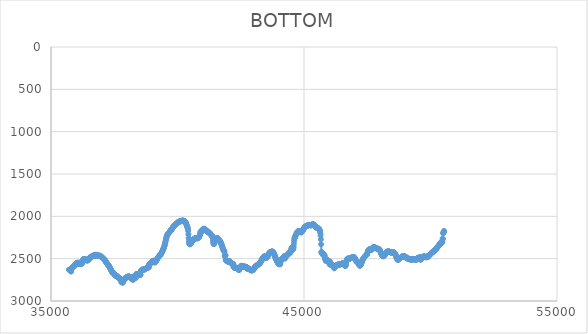
| Category | BOTTOM |
|---|---|
| 35711.8231 | 2631.15 |
| 35722.0632 | 2631.15 |
| 35732.3032 | 2631.15 |
| 35742.5432 | 2631.15 |
| 35752.7832 | 2631.15 |
| 35763.0233 | 2635.37 |
| 35773.2633 | 2641 |
| 35783.5033 | 2646.63 |
| 35793.7433 | 2652.27 |
| 35803.9833 | 2618.48 |
| 35814.2234 | 2612.85 |
| 35824.4634 | 2612.85 |
| 35834.7034 | 2607.22 |
| 35844.9434 | 2608.63 |
| 35855.1834 | 2605.81 |
| 35865.4235 | 2603 |
| 35875.6635 | 2597.37 |
| 35885.9035 | 2591.74 |
| 35896.1435 | 2590.33 |
| 35906.3836 | 2590.33 |
| 35916.6236 | 2590.33 |
| 35926.8636 | 2588.92 |
| 35937.1036 | 2584.7 |
| 35947.3436 | 2579.07 |
| 35957.5837 | 2569.22 |
| 35967.8237 | 2566.4 |
| 35978.0637 | 2560.77 |
| 35988.3037 | 2560.77 |
| 35998.5437 | 2556.55 |
| 36008.7838 | 2550.92 |
| 36019.0238 | 2553.73 |
| 36029.2638 | 2553.73 |
| 36039.5038 | 2549.51 |
| 36049.7439 | 2552.32 |
| 36059.9839 | 2553.73 |
| 36070.2239 | 2549.51 |
| 36080.4639 | 2548.1 |
| 36090.7039 | 2548.1 |
| 36100.944 | 2564.99 |
| 36111.184 | 2562.18 |
| 36121.424 | 2559.36 |
| 36131.664 | 2555.14 |
| 36141.904 | 2549.51 |
| 36152.1441 | 2555.14 |
| 36162.3841 | 2560.77 |
| 36172.6241 | 2556.55 |
| 36182.8641 | 2556.55 |
| 36193.1042 | 2559.36 |
| 36203.3442 | 2556.55 |
| 36213.5842 | 2556.55 |
| 36223.8242 | 2556.55 |
| 36234.0642 | 2553.73 |
| 36244.3043 | 2548.1 |
| 36254.5443 | 2512.91 |
| 36264.7843 | 2512.91 |
| 36275.0243 | 2510.1 |
| 36285.2643 | 2504.47 |
| 36295.5044 | 2508.69 |
| 36305.7444 | 2512.91 |
| 36315.9844 | 2510.1 |
| 36326.2244 | 2508.69 |
| 36336.4645 | 2511.5 |
| 36346.7045 | 2508.69 |
| 36356.9445 | 2508.69 |
| 36367.1845 | 2508.69 |
| 36377.4245 | 2508.69 |
| 36387.6646 | 2515.73 |
| 36397.9046 | 2515.73 |
| 36408.1446 | 2517.13 |
| 36418.3846 | 2519.95 |
| 36428.6247 | 2519.95 |
| 36438.8647 | 2521.36 |
| 36449.1047 | 2519.95 |
| 36459.3447 | 2517.13 |
| 36469.5847 | 2512.91 |
| 36479.8248 | 2514.32 |
| 36490.0648 | 2508.69 |
| 36500.3048 | 2504.47 |
| 36510.5448 | 2501.65 |
| 36520.7848 | 2501.65 |
| 36531.0249 | 2487.57 |
| 36541.2649 | 2483.35 |
| 36551.5049 | 2483.35 |
| 36561.7449 | 2487.57 |
| 36571.985 | 2488.98 |
| 36582.225 | 2479.13 |
| 36592.465 | 2477.72 |
| 36602.705 | 2479.13 |
| 36612.945 | 2474.91 |
| 36623.1851 | 2470.68 |
| 36633.4251 | 2470.68 |
| 36643.6651 | 2467.87 |
| 36653.9051 | 2465.05 |
| 36664.1451 | 2466.46 |
| 36674.3852 | 2467.87 |
| 36684.6252 | 2465.05 |
| 36694.8652 | 2460.83 |
| 36705.1052 | 2460.83 |
| 36715.3453 | 2460.83 |
| 36725.5853 | 2467.87 |
| 36735.8253 | 2465.05 |
| 36746.0653 | 2458.01 |
| 36756.3053 | 2462.24 |
| 36766.5454 | 2453.79 |
| 36776.7854 | 2455.2 |
| 36787.0254 | 2455.2 |
| 36797.2654 | 2462.24 |
| 36807.5054 | 2460.83 |
| 36817.7455 | 2463.64 |
| 36827.9855 | 2456.61 |
| 36838.2255 | 2462.24 |
| 36848.4655 | 2460.83 |
| 36858.7056 | 2462.24 |
| 36868.9456 | 2462.24 |
| 36879.1856 | 2462.24 |
| 36889.4256 | 2466.46 |
| 36899.6656 | 2466.46 |
| 36909.9057 | 2466.46 |
| 36920.1457 | 2466.46 |
| 36930.3857 | 2470.68 |
| 36940.6257 | 2465.05 |
| 36950.8657 | 2467.87 |
| 36961.1058 | 2469.28 |
| 36971.3458 | 2472.09 |
| 36981.5858 | 2476.31 |
| 36991.8258 | 2476.31 |
| 37002.0659 | 2479.13 |
| 37012.3059 | 2480.54 |
| 37022.5459 | 2486.17 |
| 37032.7859 | 2488.98 |
| 37043.0259 | 2494.61 |
| 37053.266 | 2493.2 |
| 37063.506 | 2497.43 |
| 37073.746 | 2503.06 |
| 37083.986 | 2503.06 |
| 37094.2261 | 2507.28 |
| 37104.4661 | 2510.1 |
| 37114.7061 | 2512.91 |
| 37124.9461 | 2517.13 |
| 37135.1861 | 2515.73 |
| 37145.4262 | 2526.99 |
| 37155.6662 | 2526.99 |
| 37165.9062 | 2536.84 |
| 37176.1462 | 2540.96 |
| 37186.3862 | 2545.07 |
| 37196.6263 | 2549.18 |
| 37206.8663 | 2553.3 |
| 37217.1063 | 2557.41 |
| 37227.3463 | 2561.53 |
| 37237.5864 | 2565.64 |
| 37247.8264 | 2569.76 |
| 37258.0664 | 2573.87 |
| 37268.3064 | 2577.99 |
| 37278.5464 | 2582.1 |
| 37288.7865 | 2586.22 |
| 37299.0265 | 2590.33 |
| 37309.2665 | 2596.29 |
| 37319.5065 | 2602.24 |
| 37329.7465 | 2608.2 |
| 37339.9866 | 2614.15 |
| 37350.2266 | 2620.11 |
| 37360.4666 | 2626.06 |
| 37370.7066 | 2632.02 |
| 37380.9467 | 2637.97 |
| 37391.1867 | 2643.93 |
| 37401.4267 | 2649.88 |
| 37411.6667 | 2655.84 |
| 37421.9067 | 2661.79 |
| 37432.1468 | 2667.75 |
| 37442.3868 | 2662.12 |
| 37452.6268 | 2662.12 |
| 37462.8668 | 2666.34 |
| 37473.1069 | 2671.97 |
| 37483.3469 | 2673.38 |
| 37493.5869 | 2679.01 |
| 37503.8269 | 2683.23 |
| 37514.0669 | 2680.42 |
| 37524.307 | 2694.49 |
| 37534.547 | 2698.72 |
| 37544.787 | 2697.31 |
| 37555.027 | 2700.12 |
| 37565.267 | 2701.53 |
| 37575.5071 | 2701.53 |
| 37585.7471 | 2702.94 |
| 37595.9871 | 2707.16 |
| 37606.2271 | 2705.75 |
| 37616.4672 | 2707.16 |
| 37626.7072 | 2709.98 |
| 37636.9472 | 2719.83 |
| 37647.1872 | 2719.83 |
| 37657.4272 | 2721.24 |
| 37667.6673 | 2722.65 |
| 37677.9073 | 2725.46 |
| 37688.1473 | 2729.68 |
| 37698.3873 | 2732.5 |
| 37708.6273 | 2733.91 |
| 37718.8674 | 2735.31 |
| 37729.1074 | 2738.13 |
| 37739.3474 | 2742.35 |
| 37749.5874 | 2743.76 |
| 37759.8275 | 2747.98 |
| 37770.0675 | 2747.98 |
| 37780.3075 | 2778.95 |
| 37790.5475 | 2773.32 |
| 37800.7875 | 2767.69 |
| 37811.0276 | 2767.69 |
| 37821.2676 | 2773.32 |
| 37831.5076 | 2778.95 |
| 37841.7476 | 2784.58 |
| 37851.9877 | 2747.98 |
| 37862.2277 | 2750.8 |
| 37872.4677 | 2755.02 |
| 37882.7077 | 2750.8 |
| 37892.9477 | 2749.39 |
| 37903.1878 | 2743.76 |
| 37913.4278 | 2738.13 |
| 37923.6678 | 2732.5 |
| 37933.9078 | 2732.5 |
| 37944.1478 | 2726.87 |
| 37954.3879 | 2725.46 |
| 37964.6279 | 2719.83 |
| 37974.8679 | 2719.83 |
| 37985.1079 | 2721.24 |
| 37995.348 | 2721.24 |
| 38005.588 | 2719.83 |
| 38015.828 | 2717.02 |
| 38026.068 | 2715.61 |
| 38036.308 | 2714.2 |
| 38046.5481 | 2714.2 |
| 38056.7881 | 2711.39 |
| 38067.0281 | 2711.39 |
| 38077.2681 | 2712.79 |
| 38087.5081 | 2712.79 |
| 38097.7482 | 2714.2 |
| 38107.9882 | 2714.2 |
| 38118.2282 | 2715.61 |
| 38128.4682 | 2717.02 |
| 38138.7083 | 2721.24 |
| 38148.9483 | 2721.24 |
| 38159.1883 | 2725.46 |
| 38169.4283 | 2728.28 |
| 38179.6683 | 2733.91 |
| 38189.9084 | 2735.31 |
| 38200.1484 | 2739.54 |
| 38210.3884 | 2738.13 |
| 38220.6284 | 2742.35 |
| 38230.8685 | 2745.17 |
| 38241.1085 | 2750.8 |
| 38251.3485 | 2715.61 |
| 38261.5885 | 2712.79 |
| 38271.8285 | 2709.98 |
| 38282.0686 | 2709.98 |
| 38292.3086 | 2715.61 |
| 38302.5486 | 2718.42 |
| 38312.7886 | 2718.42 |
| 38323.0286 | 2721.24 |
| 38333.2687 | 2718.42 |
| 38343.5087 | 2724.05 |
| 38353.7487 | 2726.87 |
| 38363.9887 | 2684.64 |
| 38374.2288 | 2686.05 |
| 38384.4688 | 2681.83 |
| 38394.7088 | 2681.83 |
| 38404.9488 | 2681.83 |
| 38415.1888 | 2683.23 |
| 38425.4289 | 2683.23 |
| 38435.6689 | 2688.86 |
| 38445.9089 | 2694.49 |
| 38456.1489 | 2694.49 |
| 38466.3889 | 2691.68 |
| 38476.629 | 2686.05 |
| 38486.869 | 2691.68 |
| 38497.109 | 2693.09 |
| 38507.349 | 2691.68 |
| 38517.5891 | 2690.27 |
| 38527.8291 | 2690.27 |
| 38538.0691 | 2688.86 |
| 38548.3091 | 2643.82 |
| 38558.5491 | 2649.45 |
| 38568.7892 | 2643.82 |
| 38579.0292 | 2642.41 |
| 38589.2692 | 2636.78 |
| 38599.5092 | 2631.15 |
| 38609.7493 | 2629.74 |
| 38619.9893 | 2633.97 |
| 38630.2293 | 2628.34 |
| 38640.4693 | 2626.93 |
| 38650.7093 | 2632.56 |
| 38660.9494 | 2631.15 |
| 38671.1894 | 2629.74 |
| 38681.4294 | 2628.34 |
| 38691.6694 | 2626.93 |
| 38701.9094 | 2625.52 |
| 38712.1495 | 2623.57 |
| 38722.3895 | 2621.62 |
| 38732.6295 | 2619.67 |
| 38742.8695 | 2617.72 |
| 38753.1096 | 2615.78 |
| 38763.3496 | 2613.83 |
| 38773.5896 | 2611.88 |
| 38783.8296 | 2609.93 |
| 38794.0696 | 2607.98 |
| 38804.3097 | 2606.03 |
| 38814.5497 | 2604.08 |
| 38824.7897 | 2602.13 |
| 38835.0297 | 2600.18 |
| 38845.2698 | 2600.18 |
| 38855.5098 | 2604.41 |
| 38865.7498 | 2601.59 |
| 38875.9898 | 2570.62 |
| 38886.2298 | 2564.99 |
| 38896.4699 | 2559.36 |
| 38906.7099 | 2559.36 |
| 38916.9499 | 2559.36 |
| 38927.1899 | 2559.36 |
| 38937.4299 | 2553.73 |
| 38947.67 | 2549.51 |
| 38957.91 | 2545.29 |
| 38968.15 | 2545.29 |
| 38978.39 | 2543.88 |
| 38988.6301 | 2534.03 |
| 38998.8701 | 2534.03 |
| 39009.1101 | 2529.8 |
| 39019.3501 | 2528.4 |
| 39029.5901 | 2524.17 |
| 39039.8302 | 2526.99 |
| 39050.0702 | 2525.58 |
| 39060.3102 | 2532.61 |
| 39070.5502 | 2537.72 |
| 39080.7903 | 2541.06 |
| 39091.0303 | 2542.79 |
| 39101.2703 | 2543.06 |
| 39111.5103 | 2542.02 |
| 39121.7503 | 2539.84 |
| 39131.9904 | 2536.67 |
| 39142.2304 | 2532.65 |
| 39152.4704 | 2527.96 |
| 39162.7104 | 2522.73 |
| 39172.9504 | 2517.13 |
| 39183.1905 | 2511.32 |
| 39193.4305 | 2505.44 |
| 39203.6705 | 2499.66 |
| 39213.9105 | 2494.12 |
| 39224.1506 | 2488.98 |
| 39234.3906 | 2484.36 |
| 39244.6306 | 2480.21 |
| 39254.8706 | 2476.43 |
| 39265.1106 | 2472.93 |
| 39275.3507 | 2469.61 |
| 39285.5907 | 2466.4 |
| 39295.8307 | 2463.18 |
| 39306.0707 | 2459.88 |
| 39316.3108 | 2456.4 |
| 39326.5508 | 2452.64 |
| 39336.7908 | 2448.52 |
| 39347.0308 | 2443.94 |
| 39357.2708 | 2438.83 |
| 39367.5109 | 2433.25 |
| 39377.7509 | 2427.24 |
| 39387.9909 | 2420.89 |
| 39398.2309 | 2414.25 |
| 39408.4709 | 2407.4 |
| 39418.711 | 2400.4 |
| 39428.951 | 2393.32 |
| 39439.191 | 2386.23 |
| 39449.431 | 2379.1 |
| 39459.6711 | 2371.61 |
| 39469.9111 | 2363.34 |
| 39480.1511 | 2353.85 |
| 39490.3911 | 2342.86 |
| 39500.6311 | 2330.61 |
| 39510.8712 | 2317.44 |
| 39521.1112 | 2303.72 |
| 39531.3512 | 2289.81 |
| 39541.5912 | 2276.07 |
| 39551.8313 | 2262.86 |
| 39562.0713 | 2250.53 |
| 39572.3113 | 2239.45 |
| 39582.5513 | 2229.98 |
| 39592.7913 | 2222.35 |
| 39603.0314 | 2216.31 |
| 39613.2714 | 2211.48 |
| 39623.5114 | 2207.47 |
| 39633.7514 | 2203.91 |
| 39643.9914 | 2200.42 |
| 39654.2315 | 2196.7 |
| 39664.4715 | 2192.75 |
| 39674.7115 | 2188.67 |
| 39684.9515 | 2184.54 |
| 39695.1916 | 2180.45 |
| 39705.4316 | 2176.49 |
| 39715.6716 | 2172.72 |
| 39725.9116 | 2169.07 |
| 39736.1516 | 2165.47 |
| 39746.3917 | 2161.82 |
| 39756.6317 | 2158.04 |
| 39766.8717 | 2154.05 |
| 39777.1117 | 2149.75 |
| 39787.3518 | 2145.1 |
| 39797.5918 | 2140.22 |
| 39807.8318 | 2135.27 |
| 39818.0718 | 2130.41 |
| 39828.3118 | 2125.79 |
| 39838.5519 | 2121.59 |
| 39848.7919 | 2117.92 |
| 39859.0319 | 2114.71 |
| 39869.2719 | 2111.85 |
| 39879.5119 | 2109.23 |
| 39889.752 | 2106.76 |
| 39899.992 | 2104.31 |
| 39910.232 | 2101.79 |
| 39920.472 | 2099.07 |
| 39930.7121 | 2096.09 |
| 39940.9521 | 2092.9 |
| 39951.1921 | 2089.57 |
| 39961.4321 | 2086.19 |
| 39971.6721 | 2082.84 |
| 39981.9122 | 2079.59 |
| 39992.1522 | 2076.53 |
| 40002.3922 | 2073.74 |
| 40012.6322 | 2071.27 |
| 40022.8723 | 2069.13 |
| 40033.1123 | 2067.26 |
| 40043.3523 | 2065.65 |
| 40053.5923 | 2064.25 |
| 40063.8323 | 2063.04 |
| 40074.0724 | 2061.97 |
| 40084.3124 | 2061.02 |
| 40094.5524 | 2060.15 |
| 40104.7924 | 2059.33 |
| 40115.0325 | 2058.53 |
| 40125.2725 | 2057.71 |
| 40135.5125 | 2056.84 |
| 40145.7525 | 2055.91 |
| 40155.9925 | 2054.94 |
| 40166.2326 | 2054 |
| 40176.4726 | 2053.14 |
| 40186.7126 | 2052.41 |
| 40196.9526 | 2051.88 |
| 40207.1926 | 2051.59 |
| 40217.4327 | 2051.61 |
| 40227.6727 | 2051.98 |
| 40237.9127 | 2052.75 |
| 40248.1527 | 2054 |
| 40258.3928 | 2055.76 |
| 40268.6328 | 2058.1 |
| 40278.8728 | 2061.07 |
| 40289.1128 | 2059.33 |
| 40299.3528 | 2060.54 |
| 40309.5929 | 2064.25 |
| 40319.8329 | 2070 |
| 40330.0729 | 2077.32 |
| 40340.3129 | 2085.75 |
| 40350.553 | 2094.85 |
| 40360.793 | 2104.14 |
| 40371.033 | 2113.18 |
| 40381.273 | 2121.49 |
| 40391.513 | 2128.63 |
| 40401.7531 | 2135.39 |
| 40411.9931 | 2147.58 |
| 40422.2331 | 2172.27 |
| 40432.4731 | 2212.87 |
| 40442.7131 | 2258.13 |
| 40452.9532 | 2294.73 |
| 40463.1932 | 2317.2 |
| 40473.4332 | 2327.8 |
| 40483.6732 | 2330.31 |
| 40493.9133 | 2328.51 |
| 40504.1533 | 2325.58 |
| 40514.3933 | 2322.19 |
| 40524.6333 | 2318.43 |
| 40534.8733 | 2314.36 |
| 40545.1134 | 2310.06 |
| 40555.3534 | 2305.6 |
| 40565.5934 | 2301.06 |
| 40575.8334 | 2296.5 |
| 40586.0735 | 2292 |
| 40596.3135 | 2287.63 |
| 40606.5535 | 2283.47 |
| 40616.7935 | 2279.57 |
| 40627.0335 | 2275.96 |
| 40637.2736 | 2272.65 |
| 40647.5136 | 2269.64 |
| 40657.7536 | 2266.96 |
| 40667.9936 | 2264.6 |
| 40678.2337 | 2262.58 |
| 40688.4737 | 2260.92 |
| 40698.7137 | 2259.61 |
| 40708.9537 | 2258.68 |
| 40719.1937 | 2258.13 |
| 40729.4338 | 2257.96 |
| 40739.6738 | 2258.05 |
| 40749.9138 | 2258.3 |
| 40760.1538 | 2258.58 |
| 40770.3938 | 2258.77 |
| 40780.6339 | 2258.76 |
| 40790.8739 | 2258.41 |
| 40801.1139 | 2257.61 |
| 40811.3539 | 2256.24 |
| 40821.594 | 2254.18 |
| 40831.834 | 2251.31 |
| 40842.074 | 2247.51 |
| 40852.314 | 2242.65 |
| 40862.554 | 2236.62 |
| 40872.7941 | 2229.29 |
| 40883.0341 | 2220.55 |
| 40893.2741 | 2210.27 |
| 40903.5141 | 2189.16 |
| 40913.7542 | 2190.57 |
| 40923.9942 | 2179.31 |
| 40934.2342 | 2177.9 |
| 40944.4742 | 2169.45 |
| 40954.7142 | 2169.45 |
| 40964.9543 | 2168.05 |
| 40975.1943 | 2177.9 |
| 40985.4343 | 2177.9 |
| 40995.6743 | 2156.78 |
| 41005.9143 | 2152.56 |
| 41016.1544 | 2151.15 |
| 41026.3944 | 2149.75 |
| 41036.6344 | 2148.34 |
| 41046.8744 | 2148.34 |
| 41057.1145 | 2148.34 |
| 41067.3545 | 2148.34 |
| 41077.5945 | 2149.75 |
| 41087.8345 | 2161.01 |
| 41098.0745 | 2163.82 |
| 41108.3146 | 2158.19 |
| 41118.5546 | 2163.82 |
| 41128.7946 | 2169.45 |
| 41139.0346 | 2168.05 |
| 41149.2747 | 2172.27 |
| 41159.5147 | 2175.08 |
| 41169.7547 | 2177.9 |
| 41179.9947 | 2180.71 |
| 41190.2347 | 2180.71 |
| 41200.4748 | 2186.34 |
| 41210.7148 | 2183.53 |
| 41220.9548 | 2184.94 |
| 41231.1948 | 2191.97 |
| 41241.4349 | 2194.79 |
| 41251.6749 | 2193.38 |
| 41261.9149 | 2194.79 |
| 41272.1549 | 2197.61 |
| 41282.3949 | 2197.61 |
| 41292.635 | 2207.46 |
| 41302.875 | 2208.87 |
| 41313.115 | 2208.87 |
| 41323.355 | 2218.72 |
| 41333.5951 | 2220.13 |
| 41343.8351 | 2222.94 |
| 41354.0751 | 2225.76 |
| 41364.3151 | 2227.17 |
| 41374.5551 | 2238.43 |
| 41384.7952 | 2238.43 |
| 41395.0352 | 2255.32 |
| 41405.2752 | 2288.41 |
| 41415.5152 | 2310.39 |
| 41425.7552 | 2322.88 |
| 41435.9953 | 2327.5 |
| 41446.2353 | 2325.87 |
| 41456.4753 | 2319.59 |
| 41466.7153 | 2310.29 |
| 41476.9554 | 2299.59 |
| 41487.1954 | 2289.1 |
| 41497.4354 | 2280.15 |
| 41507.6754 | 2272.9 |
| 41517.9154 | 2267.25 |
| 41528.1555 | 2263.06 |
| 41538.3955 | 2260.21 |
| 41548.6355 | 2258.6 |
| 41558.8755 | 2258.08 |
| 41569.1156 | 2258.55 |
| 41579.3556 | 2259.88 |
| 41589.5956 | 2261.96 |
| 41599.8356 | 2264.66 |
| 41610.0756 | 2267.85 |
| 41620.3157 | 2271.43 |
| 41630.5557 | 2275.27 |
| 41640.7957 | 2279.25 |
| 41651.0357 | 2283.28 |
| 41661.2758 | 2287.41 |
| 41671.5158 | 2291.72 |
| 41681.7558 | 2296.31 |
| 41691.9958 | 2301.25 |
| 41702.2358 | 2306.62 |
| 41712.4759 | 2312.51 |
| 41722.7159 | 2319.01 |
| 41732.9559 | 2326.19 |
| 41743.1959 | 2334.14 |
| 41753.4359 | 2342.89 |
| 41763.676 | 2352.19 |
| 41773.916 | 2361.75 |
| 41784.156 | 2371.27 |
| 41794.396 | 2380.47 |
| 41804.6361 | 2389.04 |
| 41814.8761 | 2396.69 |
| 41825.1161 | 2403.12 |
| 41835.3561 | 2405.93 |
| 41845.5961 | 2411.56 |
| 41855.8362 | 2415.79 |
| 41866.0762 | 2470.68 |
| 41876.3162 | 2465.05 |
| 41886.5562 | 2459.42 |
| 41896.7963 | 2460.83 |
| 41907.0363 | 2517.13 |
| 41917.2763 | 2522.76 |
| 41927.5163 | 2517.13 |
| 41937.7563 | 2524.17 |
| 41947.9964 | 2524.17 |
| 41958.2364 | 2526.99 |
| 41968.4764 | 2525.58 |
| 41978.7164 | 2525.58 |
| 41988.9565 | 2526.99 |
| 41999.1965 | 2538.25 |
| 42009.4365 | 2534.03 |
| 42019.6765 | 2535.43 |
| 42029.9165 | 2532.62 |
| 42040.1566 | 2535.43 |
| 42050.3966 | 2534.03 |
| 42060.6366 | 2528.4 |
| 42070.8766 | 2531.21 |
| 42081.1167 | 2542.47 |
| 42091.3567 | 2543.88 |
| 42101.5967 | 2545.29 |
| 42111.8367 | 2545.29 |
| 42122.0767 | 2550.92 |
| 42132.3168 | 2550.92 |
| 42142.5568 | 2550.92 |
| 42152.7968 | 2556.55 |
| 42163.0368 | 2560.77 |
| 42173.2768 | 2560.77 |
| 42183.5169 | 2560.77 |
| 42193.7569 | 2564.99 |
| 42203.9969 | 2562.18 |
| 42214.2369 | 2593.15 |
| 42224.477 | 2597.37 |
| 42234.717 | 2603 |
| 42244.957 | 2608.63 |
| 42255.197 | 2608.63 |
| 42265.437 | 2607.22 |
| 42275.6771 | 2607.22 |
| 42285.9171 | 2607.22 |
| 42296.1571 | 2605.81 |
| 42306.3971 | 2605.81 |
| 42316.6372 | 2610.04 |
| 42326.8772 | 2608.63 |
| 42337.1172 | 2610.04 |
| 42347.3572 | 2610.04 |
| 42357.5972 | 2612.85 |
| 42367.8373 | 2612.85 |
| 42378.0773 | 2614.26 |
| 42388.3173 | 2618.48 |
| 42398.5573 | 2621.3 |
| 42408.7974 | 2622.71 |
| 42419.0374 | 2633.97 |
| 42429.2774 | 2635.37 |
| 42439.5174 | 2629.74 |
| 42449.7574 | 2624.11 |
| 42459.9975 | 2619.89 |
| 42470.2375 | 2614.26 |
| 42480.4775 | 2608.63 |
| 42490.7175 | 2604.41 |
| 42500.9576 | 2604.41 |
| 42511.1976 | 2586.11 |
| 42521.4376 | 2583.29 |
| 42531.6776 | 2586.11 |
| 42541.9176 | 2591.74 |
| 42552.1577 | 2593.15 |
| 42562.3977 | 2591.74 |
| 42572.6377 | 2591.74 |
| 42582.8777 | 2593.15 |
| 42593.1177 | 2590.33 |
| 42603.3578 | 2594.55 |
| 42613.5978 | 2597.37 |
| 42623.8378 | 2598.78 |
| 42634.0778 | 2593.15 |
| 42644.3179 | 2594.55 |
| 42654.5579 | 2594.55 |
| 42664.7979 | 2594.55 |
| 42675.0379 | 2595.96 |
| 42685.2779 | 2597.37 |
| 42695.518 | 2597.37 |
| 42705.758 | 2598.78 |
| 42715.998 | 2598.78 |
| 42726.238 | 2600.18 |
| 42736.4781 | 2605.81 |
| 42746.7181 | 2604.41 |
| 42756.9581 | 2605.81 |
| 42767.1981 | 2622.71 |
| 42777.4381 | 2617.08 |
| 42787.6782 | 2617.08 |
| 42797.9182 | 2617.08 |
| 42808.1582 | 2618.48 |
| 42818.3982 | 2618.48 |
| 42828.6383 | 2618.48 |
| 42838.8783 | 2621.3 |
| 42849.1183 | 2625.52 |
| 42859.3583 | 2628.34 |
| 42869.5983 | 2629.74 |
| 42879.8384 | 2635.37 |
| 42890.0784 | 2633.97 |
| 42900.3184 | 2635.37 |
| 42910.5584 | 2638.19 |
| 42920.7985 | 2639.6 |
| 42931.0385 | 2633.97 |
| 42941.2785 | 2632.56 |
| 42951.5185 | 2638.19 |
| 42961.7585 | 2635.37 |
| 42971.9986 | 2628.34 |
| 42982.2386 | 2633.97 |
| 42992.4786 | 2633.97 |
| 43002.7186 | 2628.34 |
| 43012.9587 | 2622.23 |
| 43023.1987 | 2616.63 |
| 43033.4387 | 2611.49 |
| 43043.6787 | 2606.8 |
| 43053.9187 | 2602.52 |
| 43064.1588 | 2598.62 |
| 43074.3988 | 2595.07 |
| 43084.6388 | 2591.85 |
| 43094.8788 | 2588.92 |
| 43105.1188 | 2586.26 |
| 43115.3589 | 2583.83 |
| 43125.5989 | 2581.61 |
| 43135.8389 | 2579.56 |
| 43146.0789 | 2577.66 |
| 43156.319 | 2575.87 |
| 43166.559 | 2574.15 |
| 43176.799 | 2572.43 |
| 43187.039 | 2570.67 |
| 43197.279 | 2568.8 |
| 43207.5191 | 2566.77 |
| 43217.7591 | 2564.53 |
| 43227.9991 | 2562.02 |
| 43238.2391 | 2559.18 |
| 43248.4792 | 2555.97 |
| 43258.7192 | 2552.32 |
| 43268.9592 | 2548.21 |
| 43279.1992 | 2543.64 |
| 43289.4392 | 2538.68 |
| 43299.6793 | 2533.36 |
| 43309.9193 | 2527.73 |
| 43320.1593 | 2521.84 |
| 43330.3993 | 2515.73 |
| 43340.6394 | 2509.47 |
| 43350.8794 | 2503.25 |
| 43361.1194 | 2497.29 |
| 43371.3594 | 2491.8 |
| 43381.5994 | 2486.97 |
| 43391.8395 | 2482.86 |
| 43402.0795 | 2479.49 |
| 43412.3195 | 2476.88 |
| 43422.5595 | 2475.08 |
| 43432.7996 | 2474.09 |
| 43443.0396 | 2473.95 |
| 43453.2796 | 2474.68 |
| 43463.5196 | 2476.31 |
| 43473.7596 | 2478.79 |
| 43483.9997 | 2481.73 |
| 43494.2397 | 2484.69 |
| 43504.4797 | 2487.21 |
| 43514.7197 | 2488.83 |
| 43524.9598 | 2489.11 |
| 43535.1998 | 2487.57 |
| 43545.4398 | 2483.94 |
| 43555.6798 | 2478.54 |
| 43565.9198 | 2471.88 |
| 43576.1599 | 2464.45 |
| 43586.3999 | 2456.75 |
| 43596.6399 | 2449.28 |
| 43606.8799 | 2442.53 |
| 43617.12 | 2436.9 |
| 43627.36 | 2432.36 |
| 43637.6 | 2428.76 |
| 43647.84 | 2425.98 |
| 43658.08 | 2423.86 |
| 43668.3201 | 2422.29 |
| 43678.5601 | 2421.11 |
| 43688.8001 | 2420.2 |
| 43699.0401 | 2419.41 |
| 43709.2801 | 2418.6 |
| 43719.5202 | 2417.71 |
| 43729.7602 | 2416.93 |
| 43740.0002 | 2416.51 |
| 43750.2402 | 2416.71 |
| 43760.4803 | 2417.79 |
| 43770.7203 | 2420.01 |
| 43780.9603 | 2423.55 |
| 43791.2003 | 2428.3 |
| 43801.4403 | 2434.11 |
| 43811.6804 | 2440.78 |
| 43821.9204 | 2448.16 |
| 43832.1604 | 2456.06 |
| 43842.4004 | 2464.29 |
| 43852.6405 | 2472.65 |
| 43862.8805 | 2480.95 |
| 43873.1205 | 2488.98 |
| 43883.3605 | 2496.6 |
| 43893.6005 | 2503.82 |
| 43903.8406 | 2510.69 |
| 43914.0806 | 2517.27 |
| 43924.3206 | 2523.62 |
| 43934.5606 | 2529.8 |
| 43944.8007 | 2535.86 |
| 43955.0407 | 2541.86 |
| 43965.2807 | 2547.86 |
| 43975.5207 | 2553.91 |
| 43985.7607 | 2560.07 |
| 43996.0008 | 2566.4 |
| 44006.2408 | 2562.18 |
| 44016.4808 | 2562.18 |
| 44026.7208 | 2562.18 |
| 44036.9609 | 2556.55 |
| 44047.2009 | 2564.99 |
| 44057.4409 | 2566.4 |
| 44067.6809 | 2555.14 |
| 44077.9209 | 2521.36 |
| 44088.161 | 2525.58 |
| 44098.401 | 2514.32 |
| 44108.641 | 2512.91 |
| 44118.881 | 2511.5 |
| 44129.1211 | 2500.24 |
| 44139.3611 | 2498.84 |
| 44149.6011 | 2498.84 |
| 44159.8411 | 2494.61 |
| 44170.0811 | 2494.61 |
| 44180.3212 | 2490.39 |
| 44190.5612 | 2490.39 |
| 44200.8012 | 2481.94 |
| 44211.0412 | 2481.94 |
| 44221.2813 | 2469.28 |
| 44231.5213 | 2469.28 |
| 44241.7613 | 2469.28 |
| 44252.0013 | 2500.24 |
| 44262.2413 | 2469.28 |
| 44272.4814 | 2470.68 |
| 44282.7214 | 2472.09 |
| 44292.9614 | 2472.09 |
| 44303.2014 | 2470.68 |
| 44313.4415 | 2469.28 |
| 44323.6815 | 2460.83 |
| 44333.9215 | 2458.01 |
| 44344.1615 | 2458.01 |
| 44354.4015 | 2449.57 |
| 44364.6416 | 2449.57 |
| 44374.8816 | 2445.35 |
| 44385.1216 | 2439.72 |
| 44395.3616 | 2438.31 |
| 44405.6017 | 2438.31 |
| 44415.8417 | 2429.86 |
| 44426.0817 | 2438.31 |
| 44436.3217 | 2427.05 |
| 44446.5617 | 2432.68 |
| 44456.8018 | 2424.23 |
| 44467.0418 | 2420.01 |
| 44477.2818 | 2420.01 |
| 44487.5218 | 2393.26 |
| 44497.7619 | 2398.89 |
| 44508.0019 | 2378.79 |
| 44518.2419 | 2370.9 |
| 44528.4819 | 2371.65 |
| 44538.7219 | 2377.47 |
| 44548.962 | 2384.82 |
| 44559.202 | 2390.11 |
| 44569.442 | 2389.8 |
| 44579.682 | 2380.31 |
| 44589.9221 | 2358.07 |
| 44600.1621 | 2322.86 |
| 44610.4021 | 2287.69 |
| 44620.6421 | 2265.26 |
| 44630.8821 | 2253.55 |
| 44641.1222 | 2246.87 |
| 44651.3622 | 2240.53 |
| 44661.6022 | 2233.71 |
| 44671.8422 | 2226.61 |
| 44682.0823 | 2219.41 |
| 44692.3223 | 2212.29 |
| 44702.5623 | 2205.43 |
| 44712.8023 | 2199.01 |
| 44723.0423 | 2193.2 |
| 44733.2824 | 2188.05 |
| 44743.5224 | 2183.62 |
| 44753.7624 | 2179.94 |
| 44764.0024 | 2177.06 |
| 44774.2424 | 2175.03 |
| 44784.4825 | 2173.89 |
| 44794.7225 | 2173.68 |
| 44804.9625 | 2174.4 |
| 44815.2025 | 2175.87 |
| 44825.4426 | 2177.88 |
| 44835.6826 | 2180.2 |
| 44845.9226 | 2182.6 |
| 44856.1626 | 2184.86 |
| 44866.4026 | 2186.77 |
| 44876.6427 | 2188.09 |
| 44886.8827 | 2188.61 |
| 44897.1227 | 2188.1 |
| 44907.3627 | 2186.34 |
| 44917.6028 | 2183.2 |
| 44927.8428 | 2178.92 |
| 44938.0828 | 2173.81 |
| 44948.3228 | 2168.2 |
| 44958.5628 | 2162.42 |
| 44968.8029 | 2156.74 |
| 44979.0429 | 2151.25 |
| 44989.2829 | 2146 |
| 44999.5229 | 2141.02 |
| 45009.763 | 2136.35 |
| 45020.003 | 2132.03 |
| 45030.243 | 2128.11 |
| 45040.483 | 2124.61 |
| 45050.723 | 2121.59 |
| 45060.9631 | 2119.07 |
| 45071.2031 | 2116.98 |
| 45081.4431 | 2115.26 |
| 45091.6831 | 2113.84 |
| 45101.9232 | 2112.65 |
| 45112.1632 | 2111.6 |
| 45122.4032 | 2110.64 |
| 45132.6432 | 2109.69 |
| 45142.8832 | 2108.67 |
| 45153.1233 | 2107.52 |
| 45163.3633 | 2106.19 |
| 45173.6033 | 2104.79 |
| 45183.8433 | 2103.43 |
| 45194.0834 | 2102.26 |
| 45204.3234 | 2101.39 |
| 45214.5634 | 2100.95 |
| 45224.8034 | 2101.07 |
| 45235.0434 | 2101.89 |
| 45245.2835 | 2103.39 |
| 45255.5235 | 2105.02 |
| 45265.7635 | 2106.11 |
| 45276.0035 | 2106.13 |
| 45286.2436 | 2105.2 |
| 45296.4836 | 2103.59 |
| 45306.7236 | 2101.56 |
| 45316.9636 | 2099.41 |
| 45327.2036 | 2097.39 |
| 45337.4437 | 2095.78 |
| 45347.6837 | 2094.85 |
| 45357.9237 | 2094.82 |
| 45368.1637 | 2095.63 |
| 45378.4038 | 2097.2 |
| 45388.6438 | 2099.42 |
| 45398.8838 | 2102.18 |
| 45409.1238 | 2105.38 |
| 45419.3638 | 2108.93 |
| 45429.6039 | 2112.7 |
| 45439.8439 | 2116.56 |
| 45450.0839 | 2120.37 |
| 45460.3239 | 2123.99 |
| 45470.564 | 2127.26 |
| 45480.804 | 2130.04 |
| 45491.044 | 2132.24 |
| 45501.284 | 2133.95 |
| 45511.524 | 2135.31 |
| 45521.7641 | 2136.47 |
| 45532.0041 | 2137.56 |
| 45542.2441 | 2138.74 |
| 45552.4841 | 2140.13 |
| 45562.7242 | 2141.89 |
| 45572.9642 | 2144.15 |
| 45583.2042 | 2147.07 |
| 45593.4442 | 2150.77 |
| 45603.6842 | 2155.41 |
| 45613.9243 | 2161.12 |
| 45624.1643 | 2168.05 |
| 45634.4043 | 2177.42 |
| 45644.6443 | 2194.79 |
| 45654.8844 | 2225.64 |
| 45665.1244 | 2270.8 |
| 45675.3644 | 2329.92 |
| 45685.6044 | 2421.42 |
| 45695.8444 | 2431.27 |
| 45706.0845 | 2424.23 |
| 45716.3245 | 2427.05 |
| 45726.5645 | 2439.72 |
| 45736.8045 | 2438.31 |
| 45747.0446 | 2448.16 |
| 45757.2846 | 2458.01 |
| 45767.5246 | 2441.12 |
| 45777.7646 | 2452.38 |
| 45788.0046 | 2462.24 |
| 45798.2447 | 2463.64 |
| 45808.4847 | 2458.01 |
| 45818.7247 | 2472.09 |
| 45828.9647 | 2504.47 |
| 45839.2048 | 2500.24 |
| 45849.4448 | 2500.24 |
| 45859.6848 | 2526.99 |
| 45869.9248 | 2504.47 |
| 45880.1648 | 2514.32 |
| 45890.4049 | 2512.91 |
| 45900.6449 | 2515.73 |
| 45910.8849 | 2515.73 |
| 45921.1249 | 2519.95 |
| 45931.365 | 2519.95 |
| 45941.605 | 2521.36 |
| 45951.845 | 2521.36 |
| 45962.085 | 2534.03 |
| 45972.325 | 2535.43 |
| 45982.5651 | 2534.03 |
| 45992.8051 | 2534.03 |
| 46003.0451 | 2532.62 |
| 46013.2851 | 2567.81 |
| 46023.5252 | 2567.81 |
| 46033.7652 | 2534.03 |
| 46044.0052 | 2567.81 |
| 46054.2452 | 2567.81 |
| 46064.4852 | 2567.81 |
| 46074.7253 | 2569.22 |
| 46084.9653 | 2569.22 |
| 46095.2053 | 2569.22 |
| 46105.4453 | 2574.85 |
| 46115.6854 | 2573.44 |
| 46125.9254 | 2581.88 |
| 46136.1654 | 2586.11 |
| 46146.4054 | 2586.11 |
| 46156.6454 | 2590.33 |
| 46166.8855 | 2591.74 |
| 46177.1255 | 2594.55 |
| 46187.3655 | 2604.41 |
| 46197.6055 | 2614.26 |
| 46207.8456 | 2607.79 |
| 46218.0856 | 2602 |
| 46228.3256 | 2596.85 |
| 46238.5656 | 2592.31 |
| 46248.8056 | 2588.33 |
| 46259.0457 | 2584.87 |
| 46269.2857 | 2581.88 |
| 46279.5257 | 2579.34 |
| 46289.7657 | 2577.2 |
| 46300.0058 | 2575.42 |
| 46310.2458 | 2573.96 |
| 46320.4858 | 2572.77 |
| 46330.7258 | 2571.82 |
| 46340.9658 | 2571.07 |
| 46351.2059 | 2570.47 |
| 46361.4459 | 2569.99 |
| 46371.6859 | 2569.59 |
| 46381.9259 | 2569.22 |
| 46392.166 | 2568.84 |
| 46402.406 | 2568.44 |
| 46412.646 | 2567.98 |
| 46422.886 | 2567.44 |
| 46433.126 | 2566.79 |
| 46443.3661 | 2566.02 |
| 46453.6061 | 2565.09 |
| 46463.8461 | 2563.99 |
| 46474.0861 | 2562.68 |
| 46484.3262 | 2561.15 |
| 46494.5662 | 2559.36 |
| 46504.8062 | 2557.35 |
| 46515.0462 | 2555.35 |
| 46525.2862 | 2553.64 |
| 46535.5263 | 2552.5 |
| 46545.7663 | 2552.22 |
| 46556.0063 | 2553.09 |
| 46566.2463 | 2555.37 |
| 46576.4864 | 2559.36 |
| 46586.7264 | 2565.11 |
| 46596.9664 | 2571.72 |
| 46607.2064 | 2578.07 |
| 46617.4464 | 2583.02 |
| 46627.6865 | 2585.46 |
| 46637.9265 | 2584.26 |
| 46648.1665 | 2578.28 |
| 46658.4065 | 2566.4 |
| 46668.6466 | 2545.81 |
| 46678.8866 | 2529.8 |
| 46689.1266 | 2517.84 |
| 46699.3666 | 2509.38 |
| 46709.6066 | 2503.88 |
| 46719.8467 | 2500.81 |
| 46730.0867 | 2499.62 |
| 46740.3267 | 2499.77 |
| 46750.5667 | 2500.74 |
| 46760.8068 | 2501.96 |
| 46771.0468 | 2502.92 |
| 46781.2868 | 2503.06 |
| 46791.5268 | 2502 |
| 46801.7668 | 2499.99 |
| 46812.0069 | 2497.43 |
| 46822.2469 | 2494.71 |
| 46832.4869 | 2492.23 |
| 46842.7269 | 2490.39 |
| 46852.967 | 2489.47 |
| 46863.207 | 2489.27 |
| 46873.447 | 2489.44 |
| 46883.687 | 2489.67 |
| 46893.9271 | 2489.63 |
| 46904.1671 | 2488.98 |
| 46914.4071 | 2487.52 |
| 46924.6471 | 2485.54 |
| 46934.8871 | 2483.44 |
| 46945.1272 | 2481.64 |
| 46955.3672 | 2480.53 |
| 46965.6072 | 2480.54 |
| 46975.8472 | 2481.96 |
| 46986.0873 | 2484.7 |
| 46996.3273 | 2488.56 |
| 47006.5673 | 2493.34 |
| 47016.8073 | 2498.84 |
| 47027.0473 | 2504.84 |
| 47037.2874 | 2511.09 |
| 47047.5274 | 2517.33 |
| 47057.7674 | 2523.29 |
| 47068.0074 | 2528.71 |
| 47078.2475 | 2533.31 |
| 47088.4875 | 2536.84 |
| 47098.7275 | 2539.17 |
| 47108.9675 | 2540.73 |
| 47119.2075 | 2542.11 |
| 47129.4476 | 2543.88 |
| 47139.6876 | 2546.62 |
| 47149.9276 | 2550.92 |
| 47160.1676 | 2557.07 |
| 47170.4077 | 2564.3 |
| 47180.6477 | 2571.55 |
| 47190.8877 | 2577.76 |
| 47201.1277 | 2581.88 |
| 47211.3677 | 2583.11 |
| 47221.6078 | 2581.61 |
| 47231.8478 | 2577.82 |
| 47242.0878 | 2572.19 |
| 47252.3278 | 2565.12 |
| 47262.5679 | 2557.06 |
| 47272.8079 | 2548.43 |
| 47283.0479 | 2539.67 |
| 47293.2879 | 2531.21 |
| 47303.5279 | 2523.39 |
| 47313.768 | 2516.25 |
| 47324.008 | 2509.74 |
| 47334.248 | 2503.8 |
| 47344.488 | 2498.38 |
| 47354.7281 | 2493.43 |
| 47364.9681 | 2488.91 |
| 47375.2081 | 2484.76 |
| 47385.4481 | 2480.93 |
| 47395.6881 | 2477.36 |
| 47405.9282 | 2474.02 |
| 47416.1682 | 2470.84 |
| 47426.4082 | 2467.78 |
| 47436.6482 | 2464.79 |
| 47446.8883 | 2461.81 |
| 47457.1283 | 2458.79 |
| 47467.3683 | 2455.69 |
| 47477.6083 | 2452.44 |
| 47487.8483 | 2449.01 |
| 47498.0884 | 2445.35 |
| 47508.3284 | 2430.95 |
| 47518.5684 | 2419.29 |
| 47528.8084 | 2410.09 |
| 47539.0485 | 2403.1 |
| 47549.2885 | 2398.04 |
| 47559.5285 | 2394.65 |
| 47569.7685 | 2392.67 |
| 47580.0085 | 2391.83 |
| 47590.2486 | 2391.86 |
| 47600.4886 | 2392.49 |
| 47610.7286 | 2393.48 |
| 47620.9686 | 2394.53 |
| 47631.2087 | 2395.4 |
| 47641.4487 | 2395.82 |
| 47651.6887 | 2395.51 |
| 47661.9287 | 2394.23 |
| 47672.1687 | 2391.69 |
| 47682.4088 | 2387.63 |
| 47692.6488 | 2382.11 |
| 47702.8888 | 2376.37 |
| 47713.1288 | 2371.73 |
| 47723.3689 | 2368.33 |
| 47733.6089 | 2366.03 |
| 47743.8489 | 2364.72 |
| 47754.0889 | 2364.25 |
| 47764.3289 | 2364.5 |
| 47774.569 | 2365.32 |
| 47784.809 | 2366.6 |
| 47795.049 | 2368.19 |
| 47805.289 | 2369.97 |
| 47815.5291 | 2371.8 |
| 47825.7691 | 2373.56 |
| 47836.0091 | 2375.13 |
| 47846.2491 | 2376.51 |
| 47856.4892 | 2377.74 |
| 47866.7292 | 2378.83 |
| 47876.9692 | 2379.81 |
| 47887.2092 | 2380.71 |
| 47897.4492 | 2381.55 |
| 47907.6893 | 2382.35 |
| 47917.9293 | 2383.15 |
| 47928.1693 | 2383.96 |
| 47938.4093 | 2384.82 |
| 47948.6494 | 2385.78 |
| 47958.8894 | 2387.11 |
| 47969.1294 | 2389.07 |
| 47979.3694 | 2391.97 |
| 47989.6094 | 2396.08 |
| 47999.8495 | 2401.59 |
| 48010.0895 | 2408.24 |
| 48020.3295 | 2415.64 |
| 48030.5695 | 2423.45 |
| 48040.8096 | 2431.27 |
| 48051.0496 | 2438.78 |
| 48061.2896 | 2445.81 |
| 48071.5296 | 2452.23 |
| 48081.7696 | 2457.9 |
| 48092.0097 | 2462.68 |
| 48102.2497 | 2466.46 |
| 48112.4897 | 2469.12 |
| 48122.7297 | 2470.69 |
| 48132.9698 | 2471.2 |
| 48143.2098 | 2470.71 |
| 48153.4498 | 2469.28 |
| 48163.6898 | 2466.95 |
| 48173.9298 | 2463.85 |
| 48184.1699 | 2460.13 |
| 48194.4099 | 2455.93 |
| 48204.6499 | 2451.39 |
| 48214.8899 | 2446.64 |
| 48225.13 | 2441.84 |
| 48235.37 | 2437.11 |
| 48245.61 | 2432.6 |
| 48255.85 | 2428.45 |
| 48266.09 | 2424.79 |
| 48276.3301 | 2421.67 |
| 48286.5701 | 2419.12 |
| 48296.8101 | 2417.19 |
| 48307.0501 | 2415.9 |
| 48317.2902 | 2415.19 |
| 48327.5302 | 2414.98 |
| 48337.7702 | 2415.22 |
| 48348.0102 | 2415.82 |
| 48358.2502 | 2416.71 |
| 48368.4903 | 2417.83 |
| 48378.7303 | 2419.1 |
| 48388.9703 | 2420.44 |
| 48399.2103 | 2421.8 |
| 48409.4504 | 2423.08 |
| 48419.6904 | 2424.23 |
| 48429.9304 | 2425.19 |
| 48440.1704 | 2425.95 |
| 48450.4105 | 2426.53 |
| 48460.6505 | 2426.95 |
| 48470.8905 | 2427.23 |
| 48481.1305 | 2427.39 |
| 48491.3705 | 2427.43 |
| 48501.6106 | 2427.37 |
| 48511.8506 | 2427.24 |
| 48522.0906 | 2427.05 |
| 48532.3306 | 2426.84 |
| 48542.5707 | 2426.81 |
| 48552.8107 | 2427.17 |
| 48563.0507 | 2428.14 |
| 48573.2907 | 2429.94 |
| 48583.5307 | 2432.79 |
| 48593.7708 | 2436.92 |
| 48604.0108 | 2442.53 |
| 48614.2508 | 2449.73 |
| 48624.4908 | 2458.11 |
| 48634.7309 | 2467.14 |
| 48644.9709 | 2476.31 |
| 48655.2109 | 2485.13 |
| 48665.4509 | 2493.25 |
| 48675.6909 | 2500.39 |
| 48685.931 | 2506.24 |
| 48696.171 | 2510.52 |
| 48706.411 | 2512.91 |
| 48716.651 | 2513.26 |
| 48726.8911 | 2511.91 |
| 48737.1311 | 2509.32 |
| 48747.3711 | 2505.96 |
| 48757.6111 | 2502.31 |
| 48767.8511 | 2498.84 |
| 48778.0912 | 2495.9 |
| 48788.3312 | 2493.48 |
| 48798.5712 | 2491.46 |
| 48808.8112 | 2489.7 |
| 48819.0513 | 2488.08 |
| 48829.2913 | 2486.48 |
| 48839.5313 | 2484.76 |
| 48849.7713 | 2482.84 |
| 48860.0113 | 2480.78 |
| 48870.2514 | 2478.67 |
| 48880.4914 | 2476.61 |
| 48890.7314 | 2474.69 |
| 48900.9714 | 2472.99 |
| 48911.2115 | 2471.63 |
| 48921.4515 | 2470.68 |
| 48931.6915 | 2470.23 |
| 48941.9315 | 2470.24 |
| 48952.1715 | 2470.69 |
| 48962.4116 | 2471.51 |
| 48972.6516 | 2472.67 |
| 48982.8916 | 2474.12 |
| 48993.1316 | 2475.82 |
| 49003.3717 | 2477.72 |
| 49013.6117 | 2483.35 |
| 49023.8517 | 2484.76 |
| 49034.0917 | 2490.39 |
| 49044.3318 | 2484.76 |
| 49054.5718 | 2484.76 |
| 49064.8118 | 2490.39 |
| 49075.0518 | 2496.02 |
| 49085.2918 | 2496.02 |
| 49095.5319 | 2497.43 |
| 49105.7719 | 2496.02 |
| 49116.0119 | 2500.24 |
| 49126.2519 | 2500.24 |
| 49136.492 | 2501.65 |
| 49146.732 | 2504.47 |
| 49156.972 | 2504.47 |
| 49167.212 | 2507.28 |
| 49177.452 | 2505.87 |
| 49187.6921 | 2507.28 |
| 49197.9321 | 2508.69 |
| 49208.1721 | 2508.69 |
| 49218.4121 | 2507.28 |
| 49228.6522 | 2507.28 |
| 49238.8922 | 2507.28 |
| 49249.1322 | 2508.69 |
| 49259.3722 | 2508.69 |
| 49269.6122 | 2508.69 |
| 49279.8523 | 2508.69 |
| 49290.0923 | 2508.69 |
| 49300.3323 | 2505.87 |
| 49310.5723 | 2504.47 |
| 49320.8124 | 2504.47 |
| 49331.0524 | 2503.06 |
| 49341.2924 | 2503.06 |
| 49351.5324 | 2507.28 |
| 49361.7724 | 2510.1 |
| 49372.0125 | 2510.1 |
| 49382.2525 | 2510.1 |
| 49392.4925 | 2507.28 |
| 49402.7325 | 2507.28 |
| 49412.9726 | 2512.91 |
| 49423.2126 | 2512.91 |
| 49433.4526 | 2514.32 |
| 49443.6926 | 2508.69 |
| 49453.9327 | 2503.06 |
| 49464.1727 | 2498.84 |
| 49474.4127 | 2496.02 |
| 49484.6527 | 2496.02 |
| 49494.8927 | 2490.39 |
| 49505.1328 | 2490.39 |
| 49515.3728 | 2491.8 |
| 49525.6128 | 2491.8 |
| 49535.8528 | 2496.02 |
| 49546.0929 | 2494.61 |
| 49556.3329 | 2488.98 |
| 49566.5729 | 2483.35 |
| 49576.8129 | 2484.76 |
| 49587.0529 | 2483.35 |
| 49597.293 | 2481.94 |
| 49607.533 | 2512.91 |
| 49617.773 | 2510.1 |
| 49628.013 | 2504.47 |
| 49638.2531 | 2500.24 |
| 49648.4931 | 2494.61 |
| 49658.7331 | 2488.98 |
| 49668.9731 | 2487.57 |
| 49679.2131 | 2481.94 |
| 49689.4532 | 2479.13 |
| 49699.6932 | 2479.13 |
| 49709.9332 | 2479.13 |
| 49720.1732 | 2474.91 |
| 49730.4133 | 2474.91 |
| 49740.6533 | 2473.5 |
| 49750.8933 | 2472.09 |
| 49761.1333 | 2476.31 |
| 49771.3733 | 2479.13 |
| 49781.6134 | 2480.54 |
| 49791.8534 | 2483.35 |
| 49802.0934 | 2479.13 |
| 49812.3334 | 2481.94 |
| 49822.5735 | 2481.94 |
| 49832.8135 | 2480.54 |
| 49843.0535 | 2484.76 |
| 49853.2935 | 2479.13 |
| 49863.5336 | 2473.5 |
| 49873.7736 | 2473.5 |
| 49884.0136 | 2474.91 |
| 49894.2536 | 2477.72 |
| 49904.4936 | 2477.72 |
| 49914.7337 | 2473.5 |
| 49924.9737 | 2467.87 |
| 49935.2137 | 2466.46 |
| 49945.4537 | 2465.05 |
| 49955.6938 | 2459.42 |
| 49965.9338 | 2456.61 |
| 49976.1738 | 2455.2 |
| 49986.4138 | 2449.57 |
| 49996.6538 | 2446.75 |
| 50006.8939 | 2446.75 |
| 50017.1339 | 2442.53 |
| 50027.3739 | 2436.9 |
| 50037.6139 | 2431.27 |
| 50047.854 | 2429.86 |
| 50058.094 | 2424.23 |
| 50068.334 | 2424.23 |
| 50078.574 | 2424.23 |
| 50088.814 | 2418.6 |
| 50099.0541 | 2417.19 |
| 50109.2941 | 2420.01 |
| 50119.5341 | 2418.6 |
| 50129.7741 | 2405.93 |
| 50140.0142 | 2405.93 |
| 50150.2542 | 2404.53 |
| 50160.4942 | 2401.71 |
| 50170.7342 | 2400.3 |
| 50180.9743 | 2397.49 |
| 50191.2143 | 2397.49 |
| 50201.4543 | 2393.26 |
| 50211.6943 | 2393.26 |
| 50221.9343 | 2390.45 |
| 50232.1744 | 2389.04 |
| 50242.4144 | 2374.97 |
| 50252.6544 | 2369.33 |
| 50262.8944 | 2363.7 |
| 50273.1345 | 2363.7 |
| 50283.3745 | 2358.07 |
| 50293.6145 | 2358.07 |
| 50303.8545 | 2355.26 |
| 50314.0945 | 2351.04 |
| 50324.3346 | 2349.63 |
| 50334.5746 | 2344 |
| 50344.8146 | 2342.59 |
| 50355.0546 | 2325.7 |
| 50365.2947 | 2322.88 |
| 50375.5347 | 2317.25 |
| 50385.7747 | 2321.48 |
| 50396.0147 | 2325.7 |
| 50406.2547 | 2327.11 |
| 50416.4948 | 2321.48 |
| 50426.7348 | 2308.81 |
| 50436.9748 | 2305.99 |
| 50447.2148 | 2303.18 |
| 50457.4549 | 2300.36 |
| 50467.6949 | 2303.18 |
| 50477.9349 | 2263.76 |
| 50488.1749 | 2267.99 |
| 50498.4149 | 2200.42 |
| 50508.655 | 2194.79 |
| 50518.895 | 2189.16 |
| 50529.135 | 2175.08 |
| 50539.2889 | 2175.08 |